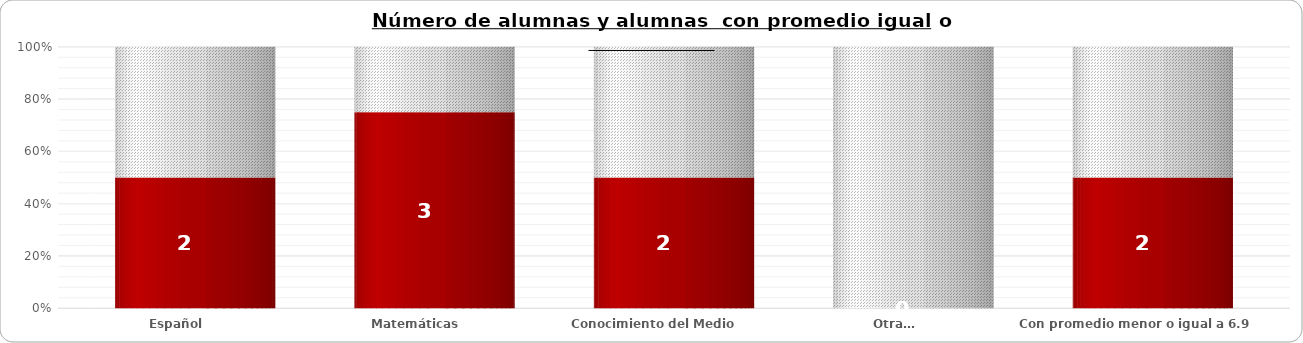
| Category | Requieren apoyo | Diferencia |
|---|---|---|
| Español | 2 | 2 |
| Matemáticas | 3 | 1 |
| Conocimiento del Medio  | 2 | 2 |
| Otra… | 0 | 4 |
| Con promedio menor o igual a 6.9 | 2 | 2 |